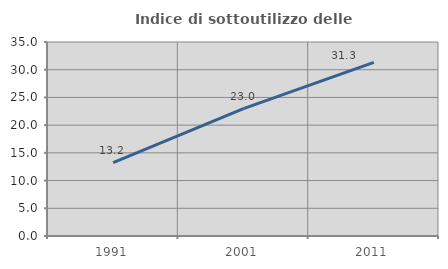
| Category | Indice di sottoutilizzo delle abitazioni  |
|---|---|
| 1991.0 | 13.235 |
| 2001.0 | 22.973 |
| 2011.0 | 31.313 |